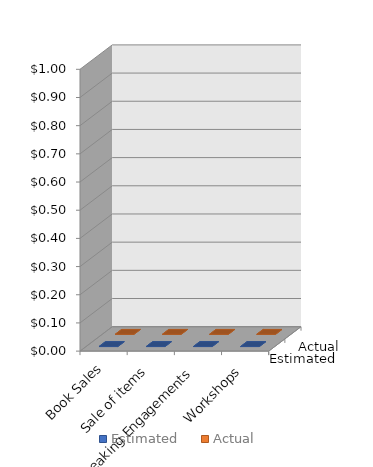
| Category | Estimated | Actual |
|---|---|---|
| Book Sales | 0 | 0 |
| Sale of items | 0 | 0 |
| Speaking Engagements | 0 | 0 |
| Workshops | 0 | 0 |